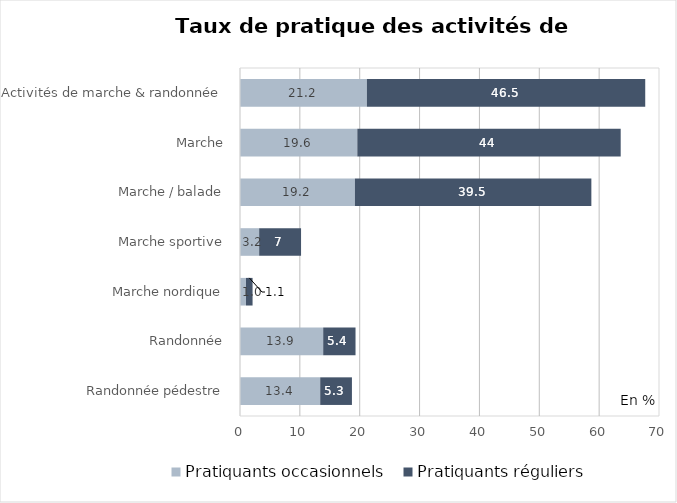
| Category | Pratiquants occasionnels | Pratiquants réguliers |
|---|---|---|
| Randonnée pédestre | 13.4 | 5.3 |
| Randonnée | 13.9 | 5.4 |
| Marche nordique | 1 | 1.1 |
| Marche sportive | 3.2 | 7 |
| Marche / balade | 19.2 | 39.5 |
| Marche | 19.6 | 44 |
| Activités de marche & randonnée | 21.2 | 46.5 |